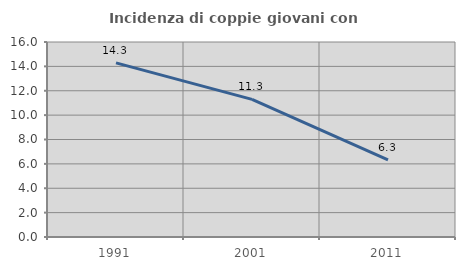
| Category | Incidenza di coppie giovani con figli |
|---|---|
| 1991.0 | 14.286 |
| 2001.0 | 11.294 |
| 2011.0 | 6.321 |